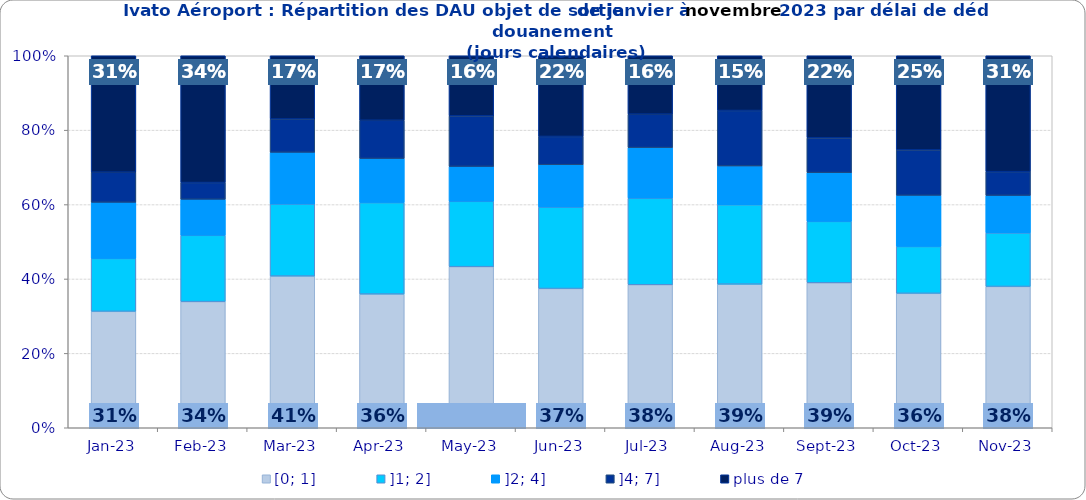
| Category | [0; 1] | ]1; 2] | ]2; 4] | ]4; 7] | plus de 7 |
|---|---|---|---|---|---|
| 2023-01-01 | 0.313 | 0.142 | 0.151 | 0.081 | 0.313 |
| 2023-02-01 | 0.339 | 0.178 | 0.097 | 0.045 | 0.341 |
| 2023-03-01 | 0.408 | 0.194 | 0.139 | 0.09 | 0.17 |
| 2023-04-01 | 0.359 | 0.246 | 0.119 | 0.103 | 0.173 |
| 2023-05-01 | 0.433 | 0.176 | 0.094 | 0.136 | 0.162 |
| 2023-06-01 | 0.374 | 0.219 | 0.114 | 0.076 | 0.217 |
| 2023-07-01 | 0.384 | 0.233 | 0.136 | 0.09 | 0.157 |
| 2023-08-01 | 0.386 | 0.214 | 0.104 | 0.149 | 0.147 |
| 2023-09-01 | 0.39 | 0.165 | 0.131 | 0.093 | 0.221 |
| 2023-10-01 | 0.361 | 0.126 | 0.137 | 0.122 | 0.253 |
| 2023-11-01 | 0.38 | 0.144 | 0.101 | 0.064 | 0.312 |